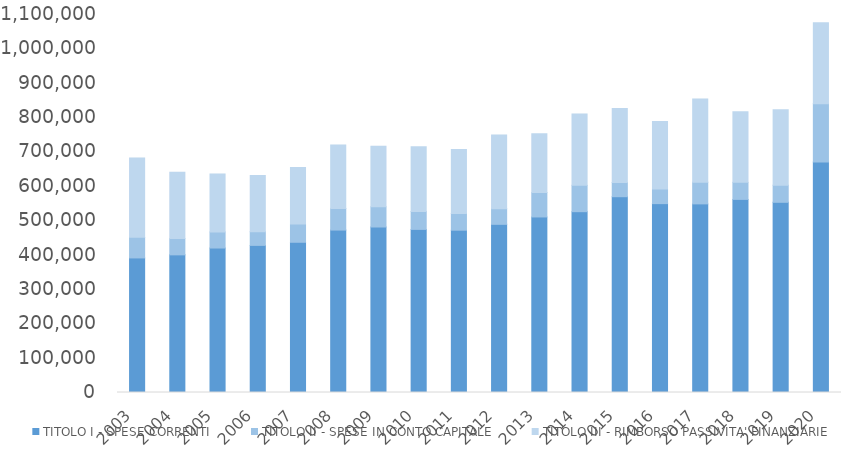
| Category | TITOLO I - SPESE CORRENTI | TITOLO II - SPESE IN CONTO CAPITALE | TITOLO III - RIMBORSO PASSIVITA' FINANZIARIE |
|---|---|---|---|
| 2003.0 | 391593 | 60035 | 230794 |
| 2004.0 | 400561 | 47364 | 192929 |
| 2005.0 | 420449 | 46794 | 168313 |
| 2006.0 | 428139 | 39854 | 163620 |
| 2007.0 | 437189 | 53157 | 164199 |
| 2008.0 | 472685.151 | 63051.551 | 184807.79 |
| 2009.0 | 481578.263 | 58913.343 | 176141.241 |
| 2010.0 | 474662.182 | 52282.257 | 188435.487 |
| 2011.0 | 472319.774 | 48502.102 | 186135.302 |
| 2012.0 | 489350.589 | 45653.028 | 214333.651 |
| 2013.0 | 510835.178 | 71174.832 | 170972.576 |
| 2014.0 | 526195.115 | 76830.108 | 207562.179 |
| 2015.0 | 569801.099 | 41309.734 | 215519.974 |
| 2016.0 | 549647.209 | 42794.164 | 195981.732 |
| 2017.0 | 548889.873 | 63180.565 | 242072.352 |
| 2018.0 | 561969.187 | 49628.079 | 205104.26 |
| 2019.0 | 553480.387 | 49806.254 | 219891.145 |
| 2020.0 | 670870.066 | 169204.411 | 236011.437 |